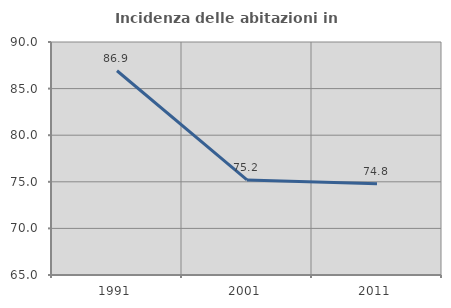
| Category | Incidenza delle abitazioni in proprietà  |
|---|---|
| 1991.0 | 86.916 |
| 2001.0 | 75.2 |
| 2011.0 | 74.803 |